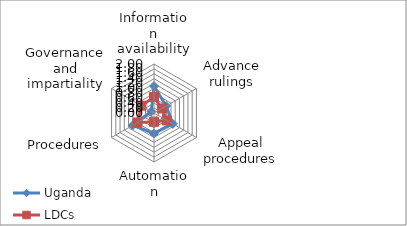
| Category | Uganda | LDCs |
|---|---|---|
| Information availability | 1.1 | 0.652 |
| Advance rulings | 0.571 | 0.368 |
| Appeal procedures | 0.889 | 0.605 |
| Automation | 0.833 | 0.36 |
| Procedures | 1 | 0.778 |
| Governance and impartiality | 0.125 | 0.591 |